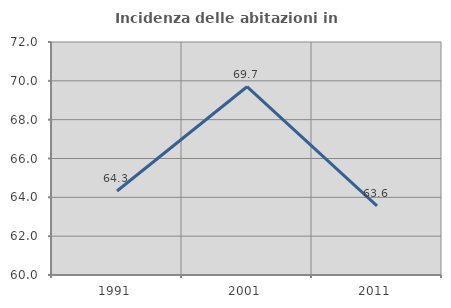
| Category | Incidenza delle abitazioni in proprietà  |
|---|---|
| 1991.0 | 64.327 |
| 2001.0 | 69.697 |
| 2011.0 | 63.556 |